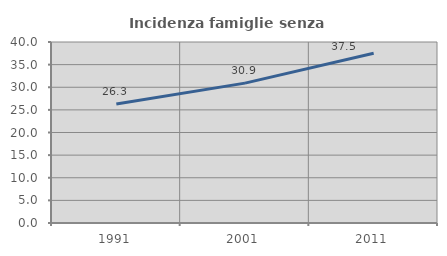
| Category | Incidenza famiglie senza nuclei |
|---|---|
| 1991.0 | 26.291 |
| 2001.0 | 30.909 |
| 2011.0 | 37.5 |